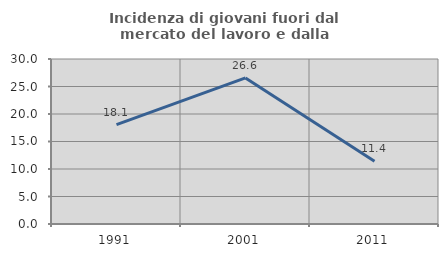
| Category | Incidenza di giovani fuori dal mercato del lavoro e dalla formazione  |
|---|---|
| 1991.0 | 18.072 |
| 2001.0 | 26.562 |
| 2011.0 | 11.429 |